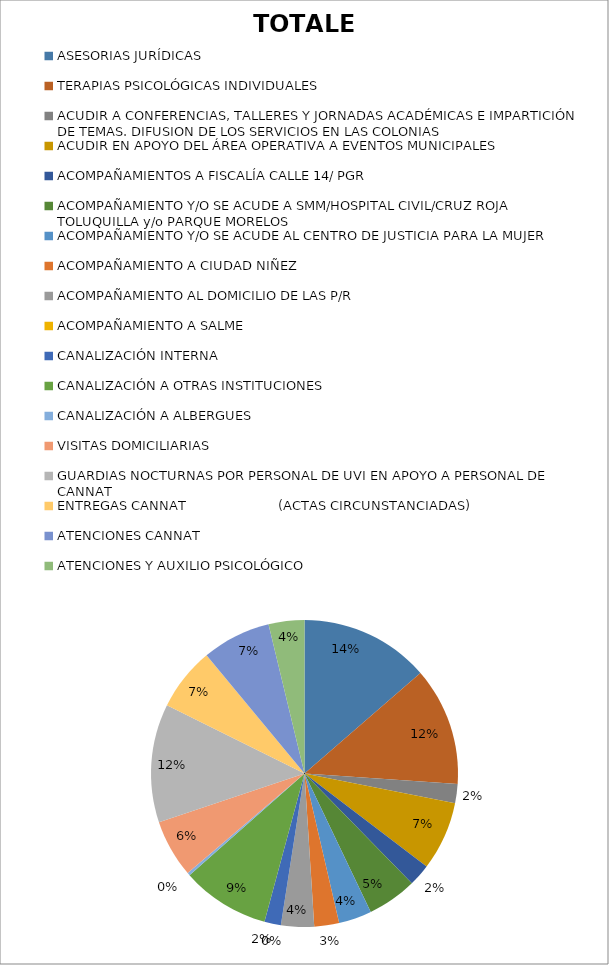
| Category | TOTALES |
|---|---|
| ASESORIAS JURÍDICAS | 47 |
| TERAPIAS PSICOLÓGICAS INDIVIDUALES | 43 |
| ACUDIR A CONFERENCIAS, TALLERES Y JORNADAS ACADÉMICAS E IMPARTICIÓN DE TEMAS. DIFUSION DE LOS SERVICIOS EN LAS COLONIAS | 7 |
| ACUDIR EN APOYO DEL ÁREA OPERATIVA A EVENTOS MUNICIPALES  | 25 |
| ACOMPAÑAMIENTOS A FISCALÍA CALLE 14/ PGR | 8 |
| ACOMPAÑAMIENTO Y/O SE ACUDE A SMM/HOSPITAL CIVIL/CRUZ ROJA TOLUQUILLA y/o PARQUE MORELOS | 18 |
| ACOMPAÑAMIENTO Y/O SE ACUDE AL CENTRO DE JUSTICIA PARA LA MUJER | 12 |
| ACOMPAÑAMIENTO A CIUDAD NIÑEZ  | 9 |
| ACOMPAÑAMIENTO AL DOMICILIO DE LAS P/R | 12 |
| ACOMPAÑAMIENTO A SALME | 0 |
| CANALIZACIÓN INTERNA | 6 |
| CANALIZACIÓN A OTRAS INSTITUCIONES | 32 |
| CANALIZACIÓN A ALBERGUES | 1 |
| VISITAS DOMICILIARIAS  | 21 |
| GUARDIAS NOCTURNAS POR PERSONAL DE UVI EN APOYO A PERSONAL DE CANNAT | 43 |
| ENTREGAS CANNAT                       (ACTAS CIRCUNSTANCIADAS) | 23 |
| ATENCIONES CANNAT | 25 |
| ATENCIONES Y AUXILIO PSICOLÓGICO | 13 |